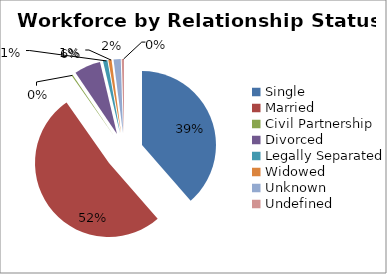
| Category | Series 0 |
|---|---|
| Single | 38.579 |
| Married | 51.696 |
| Civil Partnership | 0.251 |
| Divorced | 5.778 |
| Legally Separated | 0.951 |
| Widowed | 0.7 |
| Unknown | 1.561 |
| Undefined | 0.484 |